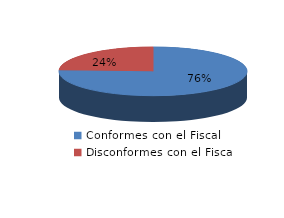
| Category | Series 0 |
|---|---|
| 0 | 1094 |
| 1 | 350 |